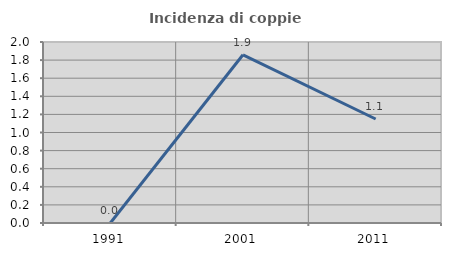
| Category | Incidenza di coppie miste |
|---|---|
| 1991.0 | 0 |
| 2001.0 | 1.859 |
| 2011.0 | 1.149 |